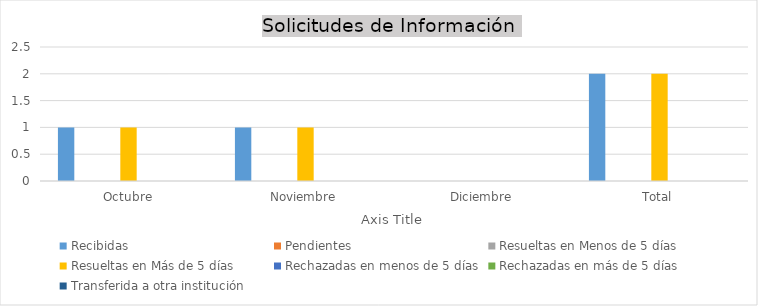
| Category | Recibidas  | Pendientes  | Resueltas en Menos de 5 días | Resueltas en Más de 5 días | Rechazadas en menos de 5 días | Rechazadas en más de 5 días | Transferida a otra institución |
|---|---|---|---|---|---|---|---|
| Octubre | 1 | 0 | 0 | 1 | 0 | 0 | 0 |
| Noviembre | 1 | 0 | 0 | 1 | 0 | 0 | 0 |
| Diciembre | 0 | 0 | 0 | 0 | 0 | 0 | 0 |
| Total | 2 | 0 | 0 | 2 | 0 | 0 | 0 |